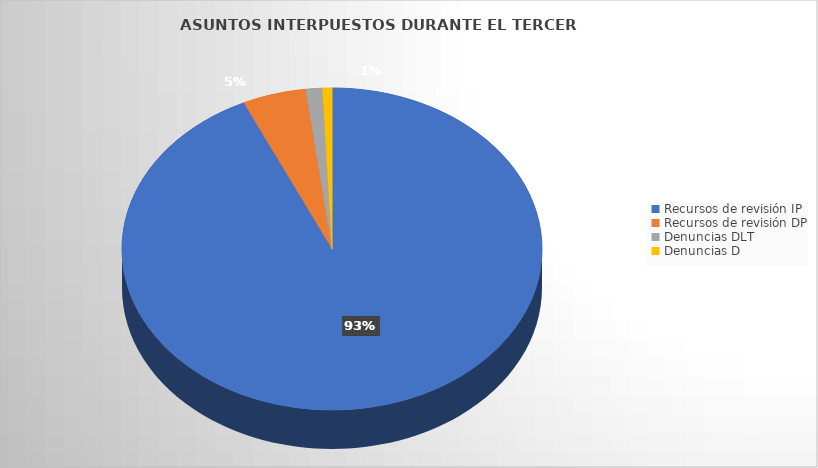
| Category | Series 0 |
|---|---|
| Recursos de revisión IP | 1390 |
| Recursos de revisión DP | 73 |
| Denuncias DLT | 19 |
| Denuncias D | 11 |